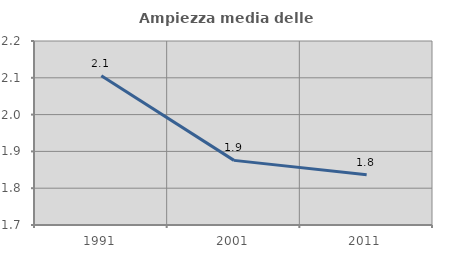
| Category | Ampiezza media delle famiglie |
|---|---|
| 1991.0 | 2.106 |
| 2001.0 | 1.876 |
| 2011.0 | 1.837 |